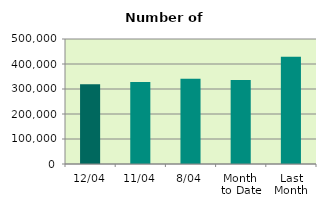
| Category | Series 0 |
|---|---|
| 12/04 | 319232 |
| 11/04 | 327718 |
| 8/04 | 340982 |
| Month 
to Date | 336024.5 |
| Last
Month | 428970.609 |